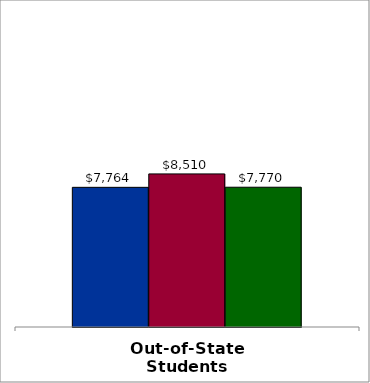
| Category | 50 states and D.C. | SREB states | State |
|---|---|---|---|
| Out-of-State Students | 7764 | 8510 | 7770 |